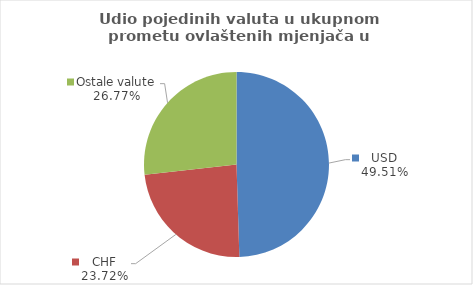
| Category | Series 0 |
|---|---|
| USD | 49.506 |
| CHF | 23.721 |
| Ostale valute | 26.774 |